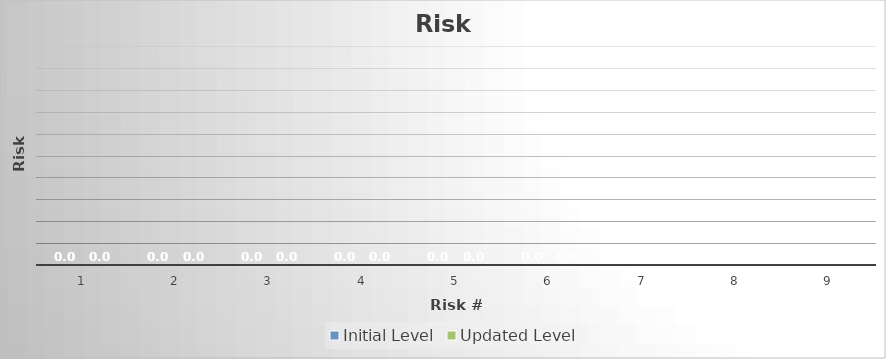
| Category | Initial Level | Updated Level |
|---|---|---|
| 0 | 0 | 0 |
| 1 | 0 | 0 |
| 2 | 0 | 0 |
| 3 | 0 | 0 |
| 4 | 0 | 0 |
| 5 | 0 | 0 |
| 6 | 0 | 0 |
| 7 | 0 | 0 |
| 8 | 0 | 0 |